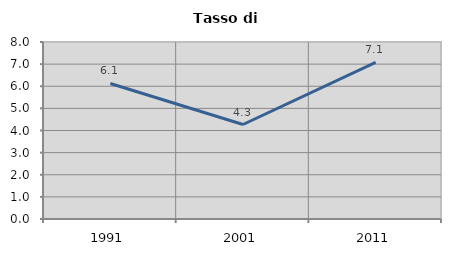
| Category | Tasso di disoccupazione   |
|---|---|
| 1991.0 | 6.126 |
| 2001.0 | 4.271 |
| 2011.0 | 7.075 |